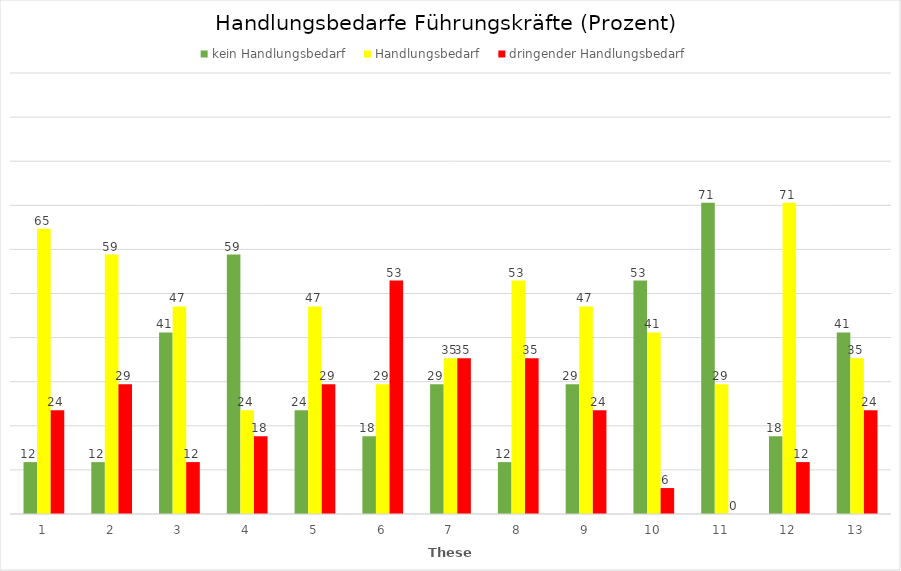
| Category | kein Handlungsbedarf | Handlungsbedarf | dringender Handlungsbedarf |
|---|---|---|---|
| 1.0 | 11.765 | 64.706 | 23.529 |
| 2.0 | 11.765 | 58.824 | 29.412 |
| 3.0 | 41.176 | 47.059 | 11.765 |
| 4.0 | 58.824 | 23.529 | 17.647 |
| 5.0 | 23.529 | 47.059 | 29.412 |
| 6.0 | 17.647 | 29.412 | 52.941 |
| 7.0 | 29.412 | 35.294 | 35.294 |
| 8.0 | 11.765 | 52.941 | 35.294 |
| 9.0 | 29.412 | 47.059 | 23.529 |
| 10.0 | 52.941 | 41.176 | 5.882 |
| 11.0 | 70.588 | 29.412 | 0 |
| 12.0 | 17.647 | 70.588 | 11.765 |
| 13.0 | 41.176 | 35.294 | 23.529 |